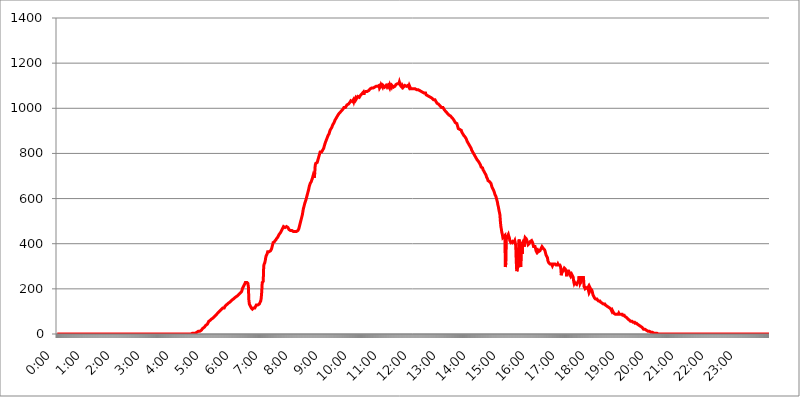
| Category | 2015.05.30. Intenzitás [W/m^2] |
|---|---|
| 0.0 | 0 |
| 0.0006944444444444445 | 0 |
| 0.001388888888888889 | 0 |
| 0.0020833333333333333 | 0 |
| 0.002777777777777778 | 0 |
| 0.003472222222222222 | 0 |
| 0.004166666666666667 | 0 |
| 0.004861111111111111 | 0 |
| 0.005555555555555556 | 0 |
| 0.0062499999999999995 | 0 |
| 0.006944444444444444 | 0 |
| 0.007638888888888889 | 0 |
| 0.008333333333333333 | 0 |
| 0.009027777777777779 | 0 |
| 0.009722222222222222 | 0 |
| 0.010416666666666666 | 0 |
| 0.011111111111111112 | 0 |
| 0.011805555555555555 | 0 |
| 0.012499999999999999 | 0 |
| 0.013194444444444444 | 0 |
| 0.013888888888888888 | 0 |
| 0.014583333333333332 | 0 |
| 0.015277777777777777 | 0 |
| 0.015972222222222224 | 0 |
| 0.016666666666666666 | 0 |
| 0.017361111111111112 | 0 |
| 0.018055555555555557 | 0 |
| 0.01875 | 0 |
| 0.019444444444444445 | 0 |
| 0.02013888888888889 | 0 |
| 0.020833333333333332 | 0 |
| 0.02152777777777778 | 0 |
| 0.022222222222222223 | 0 |
| 0.02291666666666667 | 0 |
| 0.02361111111111111 | 0 |
| 0.024305555555555556 | 0 |
| 0.024999999999999998 | 0 |
| 0.025694444444444447 | 0 |
| 0.02638888888888889 | 0 |
| 0.027083333333333334 | 0 |
| 0.027777777777777776 | 0 |
| 0.02847222222222222 | 0 |
| 0.029166666666666664 | 0 |
| 0.029861111111111113 | 0 |
| 0.030555555555555555 | 0 |
| 0.03125 | 0 |
| 0.03194444444444445 | 0 |
| 0.03263888888888889 | 0 |
| 0.03333333333333333 | 0 |
| 0.034027777777777775 | 0 |
| 0.034722222222222224 | 0 |
| 0.035416666666666666 | 0 |
| 0.036111111111111115 | 0 |
| 0.03680555555555556 | 0 |
| 0.0375 | 0 |
| 0.03819444444444444 | 0 |
| 0.03888888888888889 | 0 |
| 0.03958333333333333 | 0 |
| 0.04027777777777778 | 0 |
| 0.04097222222222222 | 0 |
| 0.041666666666666664 | 0 |
| 0.042361111111111106 | 0 |
| 0.04305555555555556 | 0 |
| 0.043750000000000004 | 0 |
| 0.044444444444444446 | 0 |
| 0.04513888888888889 | 0 |
| 0.04583333333333334 | 0 |
| 0.04652777777777778 | 0 |
| 0.04722222222222222 | 0 |
| 0.04791666666666666 | 0 |
| 0.04861111111111111 | 0 |
| 0.049305555555555554 | 0 |
| 0.049999999999999996 | 0 |
| 0.05069444444444445 | 0 |
| 0.051388888888888894 | 0 |
| 0.052083333333333336 | 0 |
| 0.05277777777777778 | 0 |
| 0.05347222222222222 | 0 |
| 0.05416666666666667 | 0 |
| 0.05486111111111111 | 0 |
| 0.05555555555555555 | 0 |
| 0.05625 | 0 |
| 0.05694444444444444 | 0 |
| 0.057638888888888885 | 0 |
| 0.05833333333333333 | 0 |
| 0.05902777777777778 | 0 |
| 0.059722222222222225 | 0 |
| 0.06041666666666667 | 0 |
| 0.061111111111111116 | 0 |
| 0.06180555555555556 | 0 |
| 0.0625 | 0 |
| 0.06319444444444444 | 0 |
| 0.06388888888888888 | 0 |
| 0.06458333333333334 | 0 |
| 0.06527777777777778 | 0 |
| 0.06597222222222222 | 0 |
| 0.06666666666666667 | 0 |
| 0.06736111111111111 | 0 |
| 0.06805555555555555 | 0 |
| 0.06874999999999999 | 0 |
| 0.06944444444444443 | 0 |
| 0.07013888888888889 | 0 |
| 0.07083333333333333 | 0 |
| 0.07152777777777779 | 0 |
| 0.07222222222222223 | 0 |
| 0.07291666666666667 | 0 |
| 0.07361111111111111 | 0 |
| 0.07430555555555556 | 0 |
| 0.075 | 0 |
| 0.07569444444444444 | 0 |
| 0.0763888888888889 | 0 |
| 0.07708333333333334 | 0 |
| 0.07777777777777778 | 0 |
| 0.07847222222222222 | 0 |
| 0.07916666666666666 | 0 |
| 0.0798611111111111 | 0 |
| 0.08055555555555556 | 0 |
| 0.08125 | 0 |
| 0.08194444444444444 | 0 |
| 0.08263888888888889 | 0 |
| 0.08333333333333333 | 0 |
| 0.08402777777777777 | 0 |
| 0.08472222222222221 | 0 |
| 0.08541666666666665 | 0 |
| 0.08611111111111112 | 0 |
| 0.08680555555555557 | 0 |
| 0.08750000000000001 | 0 |
| 0.08819444444444445 | 0 |
| 0.08888888888888889 | 0 |
| 0.08958333333333333 | 0 |
| 0.09027777777777778 | 0 |
| 0.09097222222222222 | 0 |
| 0.09166666666666667 | 0 |
| 0.09236111111111112 | 0 |
| 0.09305555555555556 | 0 |
| 0.09375 | 0 |
| 0.09444444444444444 | 0 |
| 0.09513888888888888 | 0 |
| 0.09583333333333333 | 0 |
| 0.09652777777777777 | 0 |
| 0.09722222222222222 | 0 |
| 0.09791666666666667 | 0 |
| 0.09861111111111111 | 0 |
| 0.09930555555555555 | 0 |
| 0.09999999999999999 | 0 |
| 0.10069444444444443 | 0 |
| 0.1013888888888889 | 0 |
| 0.10208333333333335 | 0 |
| 0.10277777777777779 | 0 |
| 0.10347222222222223 | 0 |
| 0.10416666666666667 | 0 |
| 0.10486111111111111 | 0 |
| 0.10555555555555556 | 0 |
| 0.10625 | 0 |
| 0.10694444444444444 | 0 |
| 0.1076388888888889 | 0 |
| 0.10833333333333334 | 0 |
| 0.10902777777777778 | 0 |
| 0.10972222222222222 | 0 |
| 0.1111111111111111 | 0 |
| 0.11180555555555556 | 0 |
| 0.11180555555555556 | 0 |
| 0.1125 | 0 |
| 0.11319444444444444 | 0 |
| 0.11388888888888889 | 0 |
| 0.11458333333333333 | 0 |
| 0.11527777777777777 | 0 |
| 0.11597222222222221 | 0 |
| 0.11666666666666665 | 0 |
| 0.1173611111111111 | 0 |
| 0.11805555555555557 | 0 |
| 0.11944444444444445 | 0 |
| 0.12013888888888889 | 0 |
| 0.12083333333333333 | 0 |
| 0.12152777777777778 | 0 |
| 0.12222222222222223 | 0 |
| 0.12291666666666667 | 0 |
| 0.12291666666666667 | 0 |
| 0.12361111111111112 | 0 |
| 0.12430555555555556 | 0 |
| 0.125 | 0 |
| 0.12569444444444444 | 0 |
| 0.12638888888888888 | 0 |
| 0.12708333333333333 | 0 |
| 0.16875 | 0 |
| 0.12847222222222224 | 0 |
| 0.12916666666666668 | 0 |
| 0.12986111111111112 | 0 |
| 0.13055555555555556 | 0 |
| 0.13125 | 0 |
| 0.13194444444444445 | 0 |
| 0.1326388888888889 | 0 |
| 0.13333333333333333 | 0 |
| 0.13402777777777777 | 0 |
| 0.13402777777777777 | 0 |
| 0.13472222222222222 | 0 |
| 0.13541666666666666 | 0 |
| 0.1361111111111111 | 0 |
| 0.13749999999999998 | 0 |
| 0.13819444444444443 | 0 |
| 0.1388888888888889 | 0 |
| 0.13958333333333334 | 0 |
| 0.14027777777777778 | 0 |
| 0.14097222222222222 | 0 |
| 0.14166666666666666 | 0 |
| 0.1423611111111111 | 0 |
| 0.14305555555555557 | 0 |
| 0.14375000000000002 | 0 |
| 0.14444444444444446 | 0 |
| 0.1451388888888889 | 0 |
| 0.1451388888888889 | 0 |
| 0.14652777777777778 | 0 |
| 0.14722222222222223 | 0 |
| 0.14791666666666667 | 0 |
| 0.1486111111111111 | 0 |
| 0.14930555555555555 | 0 |
| 0.15 | 0 |
| 0.15069444444444444 | 0 |
| 0.15138888888888888 | 0 |
| 0.15208333333333332 | 0 |
| 0.15277777777777776 | 0 |
| 0.15347222222222223 | 0 |
| 0.15416666666666667 | 0 |
| 0.15486111111111112 | 0 |
| 0.15555555555555556 | 0 |
| 0.15625 | 0 |
| 0.15694444444444444 | 0 |
| 0.15763888888888888 | 0 |
| 0.15833333333333333 | 0 |
| 0.15902777777777777 | 0 |
| 0.15972222222222224 | 0 |
| 0.16041666666666668 | 0 |
| 0.16111111111111112 | 0 |
| 0.16180555555555556 | 0 |
| 0.1625 | 0 |
| 0.16319444444444445 | 0 |
| 0.1638888888888889 | 0 |
| 0.16458333333333333 | 0 |
| 0.16527777777777777 | 0 |
| 0.16597222222222222 | 0 |
| 0.16666666666666666 | 0 |
| 0.1673611111111111 | 0 |
| 0.16805555555555554 | 0 |
| 0.16874999999999998 | 0 |
| 0.16944444444444443 | 0 |
| 0.17013888888888887 | 0 |
| 0.1708333333333333 | 0 |
| 0.17152777777777775 | 0 |
| 0.17222222222222225 | 0 |
| 0.1729166666666667 | 0 |
| 0.17361111111111113 | 0 |
| 0.17430555555555557 | 0 |
| 0.17500000000000002 | 0 |
| 0.17569444444444446 | 0 |
| 0.1763888888888889 | 0 |
| 0.17708333333333334 | 0 |
| 0.17777777777777778 | 0 |
| 0.17847222222222223 | 0 |
| 0.17916666666666667 | 0 |
| 0.1798611111111111 | 0 |
| 0.18055555555555555 | 0 |
| 0.18125 | 0 |
| 0.18194444444444444 | 0 |
| 0.1826388888888889 | 0 |
| 0.18333333333333335 | 0 |
| 0.1840277777777778 | 0 |
| 0.18472222222222223 | 0 |
| 0.18541666666666667 | 0 |
| 0.18611111111111112 | 0 |
| 0.18680555555555556 | 0 |
| 0.1875 | 0 |
| 0.18819444444444444 | 3.525 |
| 0.18888888888888888 | 3.525 |
| 0.18958333333333333 | 3.525 |
| 0.19027777777777777 | 3.525 |
| 0.1909722222222222 | 3.525 |
| 0.19166666666666665 | 3.525 |
| 0.19236111111111112 | 3.525 |
| 0.19305555555555554 | 3.525 |
| 0.19375 | 3.525 |
| 0.19444444444444445 | 7.887 |
| 0.1951388888888889 | 7.887 |
| 0.19583333333333333 | 7.887 |
| 0.19652777777777777 | 7.887 |
| 0.19722222222222222 | 12.257 |
| 0.19791666666666666 | 12.257 |
| 0.1986111111111111 | 12.257 |
| 0.19930555555555554 | 12.257 |
| 0.19999999999999998 | 12.257 |
| 0.20069444444444443 | 16.636 |
| 0.20138888888888887 | 16.636 |
| 0.2020833333333333 | 16.636 |
| 0.2027777777777778 | 21.024 |
| 0.2034722222222222 | 21.024 |
| 0.2041666666666667 | 25.419 |
| 0.20486111111111113 | 29.823 |
| 0.20555555555555557 | 29.823 |
| 0.20625000000000002 | 29.823 |
| 0.20694444444444446 | 29.823 |
| 0.2076388888888889 | 34.234 |
| 0.20833333333333334 | 38.653 |
| 0.20902777777777778 | 38.653 |
| 0.20972222222222223 | 43.079 |
| 0.21041666666666667 | 43.079 |
| 0.2111111111111111 | 47.511 |
| 0.21180555555555555 | 51.951 |
| 0.2125 | 56.398 |
| 0.21319444444444444 | 56.398 |
| 0.2138888888888889 | 56.398 |
| 0.21458333333333335 | 60.85 |
| 0.2152777777777778 | 60.85 |
| 0.21597222222222223 | 65.31 |
| 0.21666666666666667 | 65.31 |
| 0.21736111111111112 | 65.31 |
| 0.21805555555555556 | 69.775 |
| 0.21875 | 69.775 |
| 0.21944444444444444 | 74.246 |
| 0.22013888888888888 | 74.246 |
| 0.22083333333333333 | 78.722 |
| 0.22152777777777777 | 78.722 |
| 0.2222222222222222 | 83.205 |
| 0.22291666666666665 | 83.205 |
| 0.2236111111111111 | 87.692 |
| 0.22430555555555556 | 87.692 |
| 0.225 | 92.184 |
| 0.22569444444444445 | 92.184 |
| 0.2263888888888889 | 96.682 |
| 0.22708333333333333 | 96.682 |
| 0.22777777777777777 | 101.184 |
| 0.22847222222222222 | 101.184 |
| 0.22916666666666666 | 105.69 |
| 0.2298611111111111 | 105.69 |
| 0.23055555555555554 | 110.201 |
| 0.23124999999999998 | 110.201 |
| 0.23194444444444443 | 114.716 |
| 0.23263888888888887 | 114.716 |
| 0.2333333333333333 | 114.716 |
| 0.2340277777777778 | 114.716 |
| 0.2347222222222222 | 119.235 |
| 0.2354166666666667 | 123.758 |
| 0.23611111111111113 | 123.758 |
| 0.23680555555555557 | 128.284 |
| 0.23750000000000002 | 128.284 |
| 0.23819444444444446 | 128.284 |
| 0.2388888888888889 | 132.814 |
| 0.23958333333333334 | 132.814 |
| 0.24027777777777778 | 137.347 |
| 0.24097222222222223 | 137.347 |
| 0.24166666666666667 | 137.347 |
| 0.2423611111111111 | 141.884 |
| 0.24305555555555555 | 141.884 |
| 0.24375 | 146.423 |
| 0.24444444444444446 | 146.423 |
| 0.24513888888888888 | 150.964 |
| 0.24583333333333335 | 150.964 |
| 0.2465277777777778 | 150.964 |
| 0.24722222222222223 | 155.509 |
| 0.24791666666666667 | 155.509 |
| 0.24861111111111112 | 160.056 |
| 0.24930555555555556 | 160.056 |
| 0.25 | 160.056 |
| 0.25069444444444444 | 164.605 |
| 0.2513888888888889 | 164.605 |
| 0.2520833333333333 | 164.605 |
| 0.25277777777777777 | 169.156 |
| 0.2534722222222222 | 169.156 |
| 0.25416666666666665 | 173.709 |
| 0.2548611111111111 | 173.709 |
| 0.2555555555555556 | 178.264 |
| 0.25625000000000003 | 178.264 |
| 0.2569444444444445 | 182.82 |
| 0.2576388888888889 | 182.82 |
| 0.25833333333333336 | 187.378 |
| 0.2590277777777778 | 191.937 |
| 0.25972222222222224 | 201.058 |
| 0.2604166666666667 | 205.62 |
| 0.2611111111111111 | 210.182 |
| 0.26180555555555557 | 214.746 |
| 0.2625 | 219.309 |
| 0.26319444444444445 | 223.873 |
| 0.2638888888888889 | 228.436 |
| 0.26458333333333334 | 228.436 |
| 0.2652777777777778 | 228.436 |
| 0.2659722222222222 | 228.436 |
| 0.26666666666666666 | 228.436 |
| 0.2673611111111111 | 223.873 |
| 0.26805555555555555 | 210.182 |
| 0.26875 | 150.964 |
| 0.26944444444444443 | 132.814 |
| 0.2701388888888889 | 128.284 |
| 0.2708333333333333 | 123.758 |
| 0.27152777777777776 | 119.235 |
| 0.2722222222222222 | 114.716 |
| 0.27291666666666664 | 114.716 |
| 0.2736111111111111 | 110.201 |
| 0.2743055555555555 | 110.201 |
| 0.27499999999999997 | 114.716 |
| 0.27569444444444446 | 114.716 |
| 0.27638888888888885 | 114.716 |
| 0.27708333333333335 | 114.716 |
| 0.2777777777777778 | 119.235 |
| 0.27847222222222223 | 123.758 |
| 0.2791666666666667 | 128.284 |
| 0.2798611111111111 | 128.284 |
| 0.28055555555555556 | 128.284 |
| 0.28125 | 128.284 |
| 0.28194444444444444 | 128.284 |
| 0.2826388888888889 | 128.284 |
| 0.2833333333333333 | 132.814 |
| 0.28402777777777777 | 137.347 |
| 0.2847222222222222 | 141.884 |
| 0.28541666666666665 | 146.423 |
| 0.28611111111111115 | 160.056 |
| 0.28680555555555554 | 187.378 |
| 0.28750000000000003 | 228.436 |
| 0.2881944444444445 | 228.436 |
| 0.2888888888888889 | 233 |
| 0.28958333333333336 | 301.354 |
| 0.2902777777777778 | 310.44 |
| 0.29097222222222224 | 314.98 |
| 0.2916666666666667 | 324.052 |
| 0.2923611111111111 | 337.639 |
| 0.29305555555555557 | 346.682 |
| 0.29375 | 351.198 |
| 0.29444444444444445 | 355.712 |
| 0.2951388888888889 | 364.728 |
| 0.29583333333333334 | 364.728 |
| 0.2965277777777778 | 364.728 |
| 0.2972222222222222 | 364.728 |
| 0.29791666666666666 | 364.728 |
| 0.2986111111111111 | 364.728 |
| 0.29930555555555555 | 369.23 |
| 0.3 | 373.729 |
| 0.30069444444444443 | 378.224 |
| 0.3013888888888889 | 387.202 |
| 0.3020833333333333 | 396.164 |
| 0.30277777777777776 | 405.108 |
| 0.3034722222222222 | 405.108 |
| 0.30416666666666664 | 405.108 |
| 0.3048611111111111 | 409.574 |
| 0.3055555555555555 | 414.035 |
| 0.30624999999999997 | 414.035 |
| 0.3069444444444444 | 418.492 |
| 0.3076388888888889 | 422.943 |
| 0.30833333333333335 | 422.943 |
| 0.3090277777777778 | 427.39 |
| 0.30972222222222223 | 431.833 |
| 0.3104166666666667 | 436.27 |
| 0.3111111111111111 | 440.702 |
| 0.31180555555555556 | 440.702 |
| 0.3125 | 445.129 |
| 0.31319444444444444 | 449.551 |
| 0.3138888888888889 | 453.968 |
| 0.3145833333333333 | 458.38 |
| 0.31527777777777777 | 462.786 |
| 0.3159722222222222 | 467.187 |
| 0.31666666666666665 | 471.582 |
| 0.31736111111111115 | 475.972 |
| 0.31805555555555554 | 475.972 |
| 0.31875000000000003 | 475.972 |
| 0.3194444444444445 | 471.582 |
| 0.3201388888888889 | 475.972 |
| 0.32083333333333336 | 475.972 |
| 0.3215277777777778 | 475.972 |
| 0.32222222222222224 | 475.972 |
| 0.3229166666666667 | 471.582 |
| 0.3236111111111111 | 471.582 |
| 0.32430555555555557 | 467.187 |
| 0.325 | 462.786 |
| 0.32569444444444445 | 462.786 |
| 0.3263888888888889 | 458.38 |
| 0.32708333333333334 | 458.38 |
| 0.3277777777777778 | 458.38 |
| 0.3284722222222222 | 458.38 |
| 0.32916666666666666 | 458.38 |
| 0.3298611111111111 | 458.38 |
| 0.33055555555555555 | 453.968 |
| 0.33125 | 453.968 |
| 0.33194444444444443 | 453.968 |
| 0.3326388888888889 | 453.968 |
| 0.3333333333333333 | 453.968 |
| 0.3340277777777778 | 453.968 |
| 0.3347222222222222 | 453.968 |
| 0.3354166666666667 | 453.968 |
| 0.3361111111111111 | 458.38 |
| 0.3368055555555556 | 458.38 |
| 0.33749999999999997 | 458.38 |
| 0.33819444444444446 | 462.786 |
| 0.33888888888888885 | 467.187 |
| 0.33958333333333335 | 475.972 |
| 0.34027777777777773 | 484.735 |
| 0.34097222222222223 | 489.108 |
| 0.3416666666666666 | 502.192 |
| 0.3423611111111111 | 510.885 |
| 0.3430555555555555 | 519.555 |
| 0.34375 | 528.2 |
| 0.3444444444444445 | 541.121 |
| 0.3451388888888889 | 553.986 |
| 0.3458333333333334 | 562.53 |
| 0.34652777777777777 | 571.049 |
| 0.34722222222222227 | 579.542 |
| 0.34791666666666665 | 583.779 |
| 0.34861111111111115 | 592.233 |
| 0.34930555555555554 | 600.661 |
| 0.35000000000000003 | 609.062 |
| 0.3506944444444444 | 617.436 |
| 0.3513888888888889 | 625.784 |
| 0.3520833333333333 | 634.105 |
| 0.3527777777777778 | 642.4 |
| 0.3534722222222222 | 654.791 |
| 0.3541666666666667 | 658.909 |
| 0.3548611111111111 | 667.123 |
| 0.35555555555555557 | 667.123 |
| 0.35625 | 675.311 |
| 0.35694444444444445 | 679.395 |
| 0.3576388888888889 | 687.544 |
| 0.35833333333333334 | 695.666 |
| 0.3590277777777778 | 703.762 |
| 0.3597222222222222 | 699.717 |
| 0.36041666666666666 | 691.608 |
| 0.3611111111111111 | 711.832 |
| 0.36180555555555555 | 747.834 |
| 0.3625 | 755.766 |
| 0.36319444444444443 | 759.723 |
| 0.3638888888888889 | 759.723 |
| 0.3645833333333333 | 759.723 |
| 0.3652777777777778 | 767.62 |
| 0.3659722222222222 | 775.492 |
| 0.3666666666666667 | 783.342 |
| 0.3673611111111111 | 791.169 |
| 0.3680555555555556 | 798.974 |
| 0.36874999999999997 | 806.757 |
| 0.36944444444444446 | 806.757 |
| 0.37013888888888885 | 806.757 |
| 0.37083333333333335 | 806.757 |
| 0.37152777777777773 | 806.757 |
| 0.37222222222222223 | 814.519 |
| 0.3729166666666666 | 818.392 |
| 0.3736111111111111 | 822.26 |
| 0.3743055555555555 | 829.981 |
| 0.375 | 837.682 |
| 0.3756944444444445 | 845.365 |
| 0.3763888888888889 | 849.199 |
| 0.3770833333333334 | 856.855 |
| 0.37777777777777777 | 860.676 |
| 0.37847222222222227 | 868.305 |
| 0.37916666666666665 | 872.114 |
| 0.37986111111111115 | 879.719 |
| 0.38055555555555554 | 883.516 |
| 0.38125000000000003 | 887.309 |
| 0.3819444444444444 | 894.885 |
| 0.3826388888888889 | 902.447 |
| 0.3833333333333333 | 902.447 |
| 0.3840277777777778 | 909.996 |
| 0.3847222222222222 | 913.766 |
| 0.3854166666666667 | 917.534 |
| 0.3861111111111111 | 925.06 |
| 0.38680555555555557 | 928.819 |
| 0.3875 | 928.819 |
| 0.38819444444444445 | 936.33 |
| 0.3888888888888889 | 940.082 |
| 0.38958333333333334 | 947.58 |
| 0.3902777777777778 | 951.327 |
| 0.3909722222222222 | 955.071 |
| 0.39166666666666666 | 958.814 |
| 0.3923611111111111 | 962.555 |
| 0.39305555555555555 | 962.555 |
| 0.39375 | 966.295 |
| 0.39444444444444443 | 973.772 |
| 0.3951388888888889 | 973.772 |
| 0.3958333333333333 | 977.508 |
| 0.3965277777777778 | 981.244 |
| 0.3972222222222222 | 984.98 |
| 0.3979166666666667 | 984.98 |
| 0.3986111111111111 | 988.714 |
| 0.3993055555555556 | 988.714 |
| 0.39999999999999997 | 992.448 |
| 0.40069444444444446 | 996.182 |
| 0.40138888888888885 | 996.182 |
| 0.40208333333333335 | 1003.65 |
| 0.40277777777777773 | 1003.65 |
| 0.40347222222222223 | 999.916 |
| 0.4041666666666666 | 1003.65 |
| 0.4048611111111111 | 1007.383 |
| 0.4055555555555555 | 1007.383 |
| 0.40625 | 1014.852 |
| 0.4069444444444445 | 1014.852 |
| 0.4076388888888889 | 1014.852 |
| 0.4083333333333334 | 1018.587 |
| 0.40902777777777777 | 1022.323 |
| 0.40972222222222227 | 1022.323 |
| 0.41041666666666665 | 1026.06 |
| 0.41111111111111115 | 1026.06 |
| 0.41180555555555554 | 1033.537 |
| 0.41250000000000003 | 1029.798 |
| 0.4131944444444444 | 1029.798 |
| 0.4138888888888889 | 1029.798 |
| 0.4145833333333333 | 1026.06 |
| 0.4152777777777778 | 1037.277 |
| 0.4159722222222222 | 1029.798 |
| 0.4166666666666667 | 1037.277 |
| 0.4173611111111111 | 1041.019 |
| 0.41805555555555557 | 1044.762 |
| 0.41875 | 1037.277 |
| 0.41944444444444445 | 1037.277 |
| 0.4201388888888889 | 1044.762 |
| 0.42083333333333334 | 1044.762 |
| 0.4215277777777778 | 1052.255 |
| 0.4222222222222222 | 1052.255 |
| 0.42291666666666666 | 1052.255 |
| 0.4236111111111111 | 1048.508 |
| 0.42430555555555555 | 1052.255 |
| 0.425 | 1056.004 |
| 0.42569444444444443 | 1052.255 |
| 0.4263888888888889 | 1056.004 |
| 0.4270833333333333 | 1063.51 |
| 0.4277777777777778 | 1067.267 |
| 0.4284722222222222 | 1067.267 |
| 0.4291666666666667 | 1071.027 |
| 0.4298611111111111 | 1059.756 |
| 0.4305555555555556 | 1071.027 |
| 0.43124999999999997 | 1067.267 |
| 0.43194444444444446 | 1074.789 |
| 0.43263888888888885 | 1074.789 |
| 0.43333333333333335 | 1074.789 |
| 0.43402777777777773 | 1078.555 |
| 0.43472222222222223 | 1074.789 |
| 0.4354166666666666 | 1078.555 |
| 0.4361111111111111 | 1078.555 |
| 0.4368055555555555 | 1078.555 |
| 0.4375 | 1082.324 |
| 0.4381944444444445 | 1082.324 |
| 0.4388888888888889 | 1086.097 |
| 0.4395833333333334 | 1086.097 |
| 0.44027777777777777 | 1086.097 |
| 0.44097222222222227 | 1089.873 |
| 0.44166666666666665 | 1089.873 |
| 0.44236111111111115 | 1089.873 |
| 0.44305555555555554 | 1089.873 |
| 0.44375000000000003 | 1093.653 |
| 0.4444444444444444 | 1089.873 |
| 0.4451388888888889 | 1093.653 |
| 0.4458333333333333 | 1093.653 |
| 0.4465277777777778 | 1093.653 |
| 0.4472222222222222 | 1097.437 |
| 0.4479166666666667 | 1101.226 |
| 0.4486111111111111 | 1101.226 |
| 0.44930555555555557 | 1097.437 |
| 0.45 | 1097.437 |
| 0.45069444444444445 | 1097.437 |
| 0.4513888888888889 | 1101.226 |
| 0.45208333333333334 | 1089.873 |
| 0.4527777777777778 | 1093.653 |
| 0.4534722222222222 | 1097.437 |
| 0.45416666666666666 | 1105.019 |
| 0.4548611111111111 | 1101.226 |
| 0.45555555555555555 | 1101.226 |
| 0.45625 | 1093.653 |
| 0.45694444444444443 | 1101.226 |
| 0.4576388888888889 | 1101.226 |
| 0.4583333333333333 | 1101.226 |
| 0.4590277777777778 | 1093.653 |
| 0.4597222222222222 | 1097.437 |
| 0.4604166666666667 | 1093.653 |
| 0.4611111111111111 | 1101.226 |
| 0.4618055555555556 | 1101.226 |
| 0.46249999999999997 | 1093.653 |
| 0.46319444444444446 | 1093.653 |
| 0.46388888888888885 | 1101.226 |
| 0.46458333333333335 | 1101.226 |
| 0.46527777777777773 | 1093.653 |
| 0.46597222222222223 | 1101.226 |
| 0.4666666666666666 | 1093.653 |
| 0.4673611111111111 | 1101.226 |
| 0.4680555555555555 | 1101.226 |
| 0.46875 | 1093.653 |
| 0.4694444444444445 | 1101.226 |
| 0.4701388888888889 | 1101.226 |
| 0.4708333333333334 | 1101.226 |
| 0.47152777777777777 | 1093.653 |
| 0.47222222222222227 | 1093.653 |
| 0.47291666666666665 | 1097.437 |
| 0.47361111111111115 | 1097.437 |
| 0.47430555555555554 | 1101.226 |
| 0.47500000000000003 | 1105.019 |
| 0.4756944444444444 | 1108.816 |
| 0.4763888888888889 | 1108.816 |
| 0.4770833333333333 | 1108.816 |
| 0.4777777777777778 | 1108.816 |
| 0.4784722222222222 | 1108.816 |
| 0.4791666666666667 | 1108.816 |
| 0.4798611111111111 | 1116.426 |
| 0.48055555555555557 | 1108.816 |
| 0.48125 | 1101.226 |
| 0.48194444444444445 | 1101.226 |
| 0.4826388888888889 | 1101.226 |
| 0.48333333333333334 | 1093.653 |
| 0.4840277777777778 | 1101.226 |
| 0.4847222222222222 | 1101.226 |
| 0.48541666666666666 | 1093.653 |
| 0.4861111111111111 | 1097.437 |
| 0.48680555555555555 | 1093.653 |
| 0.4875 | 1101.226 |
| 0.48819444444444443 | 1105.019 |
| 0.4888888888888889 | 1097.437 |
| 0.4895833333333333 | 1097.437 |
| 0.4902777777777778 | 1093.653 |
| 0.4909722222222222 | 1097.437 |
| 0.4916666666666667 | 1101.226 |
| 0.4923611111111111 | 1101.226 |
| 0.4930555555555556 | 1093.653 |
| 0.49374999999999997 | 1101.226 |
| 0.49444444444444446 | 1097.437 |
| 0.49513888888888885 | 1097.437 |
| 0.49583333333333335 | 1086.097 |
| 0.49652777777777773 | 1089.873 |
| 0.49722222222222223 | 1086.097 |
| 0.4979166666666666 | 1086.097 |
| 0.4986111111111111 | 1086.097 |
| 0.4993055555555555 | 1082.324 |
| 0.5 | 1086.097 |
| 0.5006944444444444 | 1086.097 |
| 0.5013888888888889 | 1086.097 |
| 0.5020833333333333 | 1086.097 |
| 0.5027777777777778 | 1086.097 |
| 0.5034722222222222 | 1082.324 |
| 0.5041666666666667 | 1082.324 |
| 0.5048611111111111 | 1086.097 |
| 0.5055555555555555 | 1086.097 |
| 0.50625 | 1082.324 |
| 0.5069444444444444 | 1082.324 |
| 0.5076388888888889 | 1078.555 |
| 0.5083333333333333 | 1078.555 |
| 0.5090277777777777 | 1074.789 |
| 0.5097222222222222 | 1074.789 |
| 0.5104166666666666 | 1074.789 |
| 0.5111111111111112 | 1074.789 |
| 0.5118055555555555 | 1074.789 |
| 0.5125000000000001 | 1071.027 |
| 0.5131944444444444 | 1071.027 |
| 0.513888888888889 | 1067.267 |
| 0.5145833333333333 | 1067.267 |
| 0.5152777777777778 | 1063.51 |
| 0.5159722222222222 | 1063.51 |
| 0.5166666666666667 | 1067.267 |
| 0.517361111111111 | 1059.756 |
| 0.5180555555555556 | 1059.756 |
| 0.5187499999999999 | 1056.004 |
| 0.5194444444444445 | 1056.004 |
| 0.5201388888888888 | 1056.004 |
| 0.5208333333333334 | 1052.255 |
| 0.5215277777777778 | 1052.255 |
| 0.5222222222222223 | 1048.508 |
| 0.5229166666666667 | 1048.508 |
| 0.5236111111111111 | 1048.508 |
| 0.5243055555555556 | 1052.255 |
| 0.525 | 1044.762 |
| 0.5256944444444445 | 1044.762 |
| 0.5263888888888889 | 1041.019 |
| 0.5270833333333333 | 1041.019 |
| 0.5277777777777778 | 1037.277 |
| 0.5284722222222222 | 1037.277 |
| 0.5291666666666667 | 1033.537 |
| 0.5298611111111111 | 1037.277 |
| 0.5305555555555556 | 1033.537 |
| 0.53125 | 1029.798 |
| 0.5319444444444444 | 1029.798 |
| 0.5326388888888889 | 1022.323 |
| 0.5333333333333333 | 1022.323 |
| 0.5340277777777778 | 1022.323 |
| 0.5347222222222222 | 1018.587 |
| 0.5354166666666667 | 1014.852 |
| 0.5361111111111111 | 1014.852 |
| 0.5368055555555555 | 1011.118 |
| 0.5375 | 1007.383 |
| 0.5381944444444444 | 1007.383 |
| 0.5388888888888889 | 1003.65 |
| 0.5395833333333333 | 1003.65 |
| 0.5402777777777777 | 1003.65 |
| 0.5409722222222222 | 1003.65 |
| 0.5416666666666666 | 999.916 |
| 0.5423611111111112 | 999.916 |
| 0.5430555555555555 | 992.448 |
| 0.5437500000000001 | 996.182 |
| 0.5444444444444444 | 988.714 |
| 0.545138888888889 | 984.98 |
| 0.5458333333333333 | 981.244 |
| 0.5465277777777778 | 984.98 |
| 0.5472222222222222 | 977.508 |
| 0.5479166666666667 | 977.508 |
| 0.548611111111111 | 973.772 |
| 0.5493055555555556 | 970.034 |
| 0.5499999999999999 | 970.034 |
| 0.5506944444444445 | 970.034 |
| 0.5513888888888888 | 966.295 |
| 0.5520833333333334 | 962.555 |
| 0.5527777777777778 | 962.555 |
| 0.5534722222222223 | 958.814 |
| 0.5541666666666667 | 955.071 |
| 0.5548611111111111 | 955.071 |
| 0.5555555555555556 | 951.327 |
| 0.55625 | 947.58 |
| 0.5569444444444445 | 943.832 |
| 0.5576388888888889 | 943.832 |
| 0.5583333333333333 | 936.33 |
| 0.5590277777777778 | 932.576 |
| 0.5597222222222222 | 932.576 |
| 0.5604166666666667 | 932.576 |
| 0.5611111111111111 | 925.06 |
| 0.5618055555555556 | 917.534 |
| 0.5625 | 909.996 |
| 0.5631944444444444 | 909.996 |
| 0.5638888888888889 | 909.996 |
| 0.5645833333333333 | 906.223 |
| 0.5652777777777778 | 906.223 |
| 0.5659722222222222 | 902.447 |
| 0.5666666666666667 | 902.447 |
| 0.5673611111111111 | 894.885 |
| 0.5680555555555555 | 891.099 |
| 0.56875 | 887.309 |
| 0.5694444444444444 | 883.516 |
| 0.5701388888888889 | 879.719 |
| 0.5708333333333333 | 879.719 |
| 0.5715277777777777 | 875.918 |
| 0.5722222222222222 | 872.114 |
| 0.5729166666666666 | 868.305 |
| 0.5736111111111112 | 864.493 |
| 0.5743055555555555 | 860.676 |
| 0.5750000000000001 | 853.029 |
| 0.5756944444444444 | 849.199 |
| 0.576388888888889 | 845.365 |
| 0.5770833333333333 | 841.526 |
| 0.5777777777777778 | 837.682 |
| 0.5784722222222222 | 833.834 |
| 0.5791666666666667 | 829.981 |
| 0.579861111111111 | 826.123 |
| 0.5805555555555556 | 822.26 |
| 0.5812499999999999 | 814.519 |
| 0.5819444444444445 | 810.641 |
| 0.5826388888888888 | 806.757 |
| 0.5833333333333334 | 806.757 |
| 0.5840277777777778 | 802.868 |
| 0.5847222222222223 | 795.074 |
| 0.5854166666666667 | 791.169 |
| 0.5861111111111111 | 787.258 |
| 0.5868055555555556 | 783.342 |
| 0.5875 | 779.42 |
| 0.5881944444444445 | 775.492 |
| 0.5888888888888889 | 771.559 |
| 0.5895833333333333 | 767.62 |
| 0.5902777777777778 | 767.62 |
| 0.5909722222222222 | 763.674 |
| 0.5916666666666667 | 759.723 |
| 0.5923611111111111 | 755.766 |
| 0.5930555555555556 | 751.803 |
| 0.59375 | 747.834 |
| 0.5944444444444444 | 739.877 |
| 0.5951388888888889 | 739.877 |
| 0.5958333333333333 | 735.89 |
| 0.5965277777777778 | 735.89 |
| 0.5972222222222222 | 727.896 |
| 0.5979166666666667 | 723.889 |
| 0.5986111111111111 | 719.877 |
| 0.5993055555555555 | 715.858 |
| 0.6 | 711.832 |
| 0.6006944444444444 | 707.8 |
| 0.6013888888888889 | 703.762 |
| 0.6020833333333333 | 695.666 |
| 0.6027777777777777 | 691.608 |
| 0.6034722222222222 | 687.544 |
| 0.6041666666666666 | 679.395 |
| 0.6048611111111112 | 675.311 |
| 0.6055555555555555 | 679.395 |
| 0.6062500000000001 | 675.311 |
| 0.6069444444444444 | 671.22 |
| 0.607638888888889 | 671.22 |
| 0.6083333333333333 | 667.123 |
| 0.6090277777777778 | 658.909 |
| 0.6097222222222222 | 650.667 |
| 0.6104166666666667 | 650.667 |
| 0.611111111111111 | 650.667 |
| 0.6118055555555556 | 638.256 |
| 0.6124999999999999 | 634.105 |
| 0.6131944444444445 | 625.784 |
| 0.6138888888888888 | 617.436 |
| 0.6145833333333334 | 613.252 |
| 0.6152777777777778 | 609.062 |
| 0.6159722222222223 | 600.661 |
| 0.6166666666666667 | 592.233 |
| 0.6173611111111111 | 583.779 |
| 0.6180555555555556 | 571.049 |
| 0.61875 | 562.53 |
| 0.6194444444444445 | 549.704 |
| 0.6201388888888889 | 545.416 |
| 0.6208333333333333 | 528.2 |
| 0.6215277777777778 | 497.836 |
| 0.6222222222222222 | 475.972 |
| 0.6229166666666667 | 462.786 |
| 0.6236111111111111 | 449.551 |
| 0.6243055555555556 | 440.702 |
| 0.625 | 427.39 |
| 0.6256944444444444 | 427.39 |
| 0.6263888888888889 | 431.833 |
| 0.6270833333333333 | 431.833 |
| 0.6277777777777778 | 436.27 |
| 0.6284722222222222 | 296.808 |
| 0.6291666666666667 | 314.98 |
| 0.6298611111111111 | 418.492 |
| 0.6305555555555555 | 431.833 |
| 0.63125 | 431.833 |
| 0.6319444444444444 | 436.27 |
| 0.6326388888888889 | 440.702 |
| 0.6333333333333333 | 431.833 |
| 0.6340277777777777 | 427.39 |
| 0.6347222222222222 | 414.035 |
| 0.6354166666666666 | 409.574 |
| 0.6361111111111112 | 405.108 |
| 0.6368055555555555 | 405.108 |
| 0.6375000000000001 | 405.108 |
| 0.6381944444444444 | 409.574 |
| 0.638888888888889 | 405.108 |
| 0.6395833333333333 | 405.108 |
| 0.6402777777777778 | 405.108 |
| 0.6409722222222222 | 409.574 |
| 0.6416666666666667 | 414.035 |
| 0.642361111111111 | 414.035 |
| 0.6430555555555556 | 391.685 |
| 0.6437499999999999 | 324.052 |
| 0.6444444444444445 | 278.603 |
| 0.6451388888888888 | 283.156 |
| 0.6458333333333334 | 296.808 |
| 0.6465277777777778 | 319.517 |
| 0.6472222222222223 | 396.164 |
| 0.6479166666666667 | 418.492 |
| 0.6486111111111111 | 355.712 |
| 0.6493055555555556 | 301.354 |
| 0.65 | 296.808 |
| 0.6506944444444445 | 369.23 |
| 0.6513888888888889 | 405.108 |
| 0.6520833333333333 | 355.712 |
| 0.6527777777777778 | 405.108 |
| 0.6534722222222222 | 409.574 |
| 0.6541666666666667 | 405.108 |
| 0.6548611111111111 | 387.202 |
| 0.6555555555555556 | 414.035 |
| 0.65625 | 427.39 |
| 0.6569444444444444 | 427.39 |
| 0.6576388888888889 | 422.943 |
| 0.6583333333333333 | 418.492 |
| 0.6590277777777778 | 409.574 |
| 0.6597222222222222 | 405.108 |
| 0.6604166666666667 | 396.164 |
| 0.6611111111111111 | 396.164 |
| 0.6618055555555555 | 400.638 |
| 0.6625 | 405.108 |
| 0.6631944444444444 | 409.574 |
| 0.6638888888888889 | 409.574 |
| 0.6645833333333333 | 409.574 |
| 0.6652777777777777 | 414.035 |
| 0.6659722222222222 | 414.035 |
| 0.6666666666666666 | 405.108 |
| 0.6673611111111111 | 396.164 |
| 0.6680555555555556 | 387.202 |
| 0.6687500000000001 | 387.202 |
| 0.6694444444444444 | 387.202 |
| 0.6701388888888888 | 387.202 |
| 0.6708333333333334 | 378.224 |
| 0.6715277777777778 | 369.23 |
| 0.6722222222222222 | 364.728 |
| 0.6729166666666666 | 369.23 |
| 0.6736111111111112 | 364.728 |
| 0.6743055555555556 | 369.23 |
| 0.6749999999999999 | 364.728 |
| 0.6756944444444444 | 364.728 |
| 0.6763888888888889 | 364.728 |
| 0.6770833333333334 | 369.23 |
| 0.6777777777777777 | 369.23 |
| 0.6784722222222223 | 378.224 |
| 0.6791666666666667 | 382.715 |
| 0.6798611111111111 | 387.202 |
| 0.6805555555555555 | 387.202 |
| 0.68125 | 387.202 |
| 0.6819444444444445 | 378.224 |
| 0.6826388888888889 | 378.224 |
| 0.6833333333333332 | 373.729 |
| 0.6840277777777778 | 369.23 |
| 0.6847222222222222 | 360.221 |
| 0.6854166666666667 | 351.198 |
| 0.686111111111111 | 346.682 |
| 0.6868055555555556 | 342.162 |
| 0.6875 | 337.639 |
| 0.6881944444444444 | 324.052 |
| 0.688888888888889 | 319.517 |
| 0.6895833333333333 | 314.98 |
| 0.6902777777777778 | 314.98 |
| 0.6909722222222222 | 310.44 |
| 0.6916666666666668 | 310.44 |
| 0.6923611111111111 | 310.44 |
| 0.6930555555555555 | 310.44 |
| 0.69375 | 305.898 |
| 0.6944444444444445 | 301.354 |
| 0.6951388888888889 | 305.898 |
| 0.6958333333333333 | 310.44 |
| 0.6965277777777777 | 310.44 |
| 0.6972222222222223 | 310.44 |
| 0.6979166666666666 | 310.44 |
| 0.6986111111111111 | 310.44 |
| 0.6993055555555556 | 305.898 |
| 0.7000000000000001 | 305.898 |
| 0.7006944444444444 | 305.898 |
| 0.7013888888888888 | 305.898 |
| 0.7020833333333334 | 310.44 |
| 0.7027777777777778 | 305.898 |
| 0.7034722222222222 | 305.898 |
| 0.7041666666666666 | 305.898 |
| 0.7048611111111112 | 305.898 |
| 0.7055555555555556 | 301.354 |
| 0.7062499999999999 | 292.259 |
| 0.7069444444444444 | 260.373 |
| 0.7076388888888889 | 278.603 |
| 0.7083333333333334 | 274.047 |
| 0.7090277777777777 | 278.603 |
| 0.7097222222222223 | 278.603 |
| 0.7104166666666667 | 287.709 |
| 0.7111111111111111 | 292.259 |
| 0.7118055555555555 | 292.259 |
| 0.7125 | 287.709 |
| 0.7131944444444445 | 278.603 |
| 0.7138888888888889 | 274.047 |
| 0.7145833333333332 | 255.813 |
| 0.7152777777777778 | 278.603 |
| 0.7159722222222222 | 278.603 |
| 0.7166666666666667 | 278.603 |
| 0.717361111111111 | 278.603 |
| 0.7180555555555556 | 278.603 |
| 0.71875 | 269.49 |
| 0.7194444444444444 | 260.373 |
| 0.720138888888889 | 255.813 |
| 0.7208333333333333 | 260.373 |
| 0.7215277777777778 | 264.932 |
| 0.7222222222222222 | 260.373 |
| 0.7229166666666668 | 260.373 |
| 0.7236111111111111 | 251.251 |
| 0.7243055555555555 | 233 |
| 0.725 | 223.873 |
| 0.7256944444444445 | 228.436 |
| 0.7263888888888889 | 223.873 |
| 0.7270833333333333 | 223.873 |
| 0.7277777777777777 | 223.873 |
| 0.7284722222222223 | 219.309 |
| 0.7291666666666666 | 219.309 |
| 0.7298611111111111 | 219.309 |
| 0.7305555555555556 | 233 |
| 0.7312500000000001 | 237.564 |
| 0.7319444444444444 | 255.813 |
| 0.7326388888888888 | 255.813 |
| 0.7333333333333334 | 223.873 |
| 0.7340277777777778 | 228.436 |
| 0.7347222222222222 | 233 |
| 0.7354166666666666 | 255.813 |
| 0.7361111111111112 | 242.127 |
| 0.7368055555555556 | 246.689 |
| 0.7374999999999999 | 255.813 |
| 0.7381944444444444 | 242.127 |
| 0.7388888888888889 | 210.182 |
| 0.7395833333333334 | 205.62 |
| 0.7402777777777777 | 201.058 |
| 0.7409722222222223 | 201.058 |
| 0.7416666666666667 | 205.62 |
| 0.7423611111111111 | 205.62 |
| 0.7430555555555555 | 205.62 |
| 0.74375 | 201.058 |
| 0.7444444444444445 | 205.62 |
| 0.7451388888888889 | 191.937 |
| 0.7458333333333332 | 182.82 |
| 0.7465277777777778 | 187.378 |
| 0.7472222222222222 | 205.62 |
| 0.7479166666666667 | 201.058 |
| 0.748611111111111 | 201.058 |
| 0.7493055555555556 | 196.497 |
| 0.75 | 191.937 |
| 0.7506944444444444 | 182.82 |
| 0.751388888888889 | 173.709 |
| 0.7520833333333333 | 169.156 |
| 0.7527777777777778 | 164.605 |
| 0.7534722222222222 | 160.056 |
| 0.7541666666666668 | 160.056 |
| 0.7548611111111111 | 155.509 |
| 0.7555555555555555 | 155.509 |
| 0.75625 | 155.509 |
| 0.7569444444444445 | 155.509 |
| 0.7576388888888889 | 150.964 |
| 0.7583333333333333 | 150.964 |
| 0.7590277777777777 | 146.423 |
| 0.7597222222222223 | 146.423 |
| 0.7604166666666666 | 146.423 |
| 0.7611111111111111 | 146.423 |
| 0.7618055555555556 | 141.884 |
| 0.7625000000000001 | 141.884 |
| 0.7631944444444444 | 141.884 |
| 0.7638888888888888 | 137.347 |
| 0.7645833333333334 | 137.347 |
| 0.7652777777777778 | 137.347 |
| 0.7659722222222222 | 132.814 |
| 0.7666666666666666 | 132.814 |
| 0.7673611111111112 | 132.814 |
| 0.7680555555555556 | 132.814 |
| 0.7687499999999999 | 128.284 |
| 0.7694444444444444 | 128.284 |
| 0.7701388888888889 | 128.284 |
| 0.7708333333333334 | 123.758 |
| 0.7715277777777777 | 123.758 |
| 0.7722222222222223 | 123.758 |
| 0.7729166666666667 | 119.235 |
| 0.7736111111111111 | 119.235 |
| 0.7743055555555555 | 119.235 |
| 0.775 | 114.716 |
| 0.7756944444444445 | 114.716 |
| 0.7763888888888889 | 110.201 |
| 0.7770833333333332 | 105.69 |
| 0.7777777777777778 | 101.184 |
| 0.7784722222222222 | 105.69 |
| 0.7791666666666667 | 101.184 |
| 0.779861111111111 | 101.184 |
| 0.7805555555555556 | 92.184 |
| 0.78125 | 92.184 |
| 0.7819444444444444 | 92.184 |
| 0.782638888888889 | 87.692 |
| 0.7833333333333333 | 87.692 |
| 0.7840277777777778 | 87.692 |
| 0.7847222222222222 | 87.692 |
| 0.7854166666666668 | 87.692 |
| 0.7861111111111111 | 87.692 |
| 0.7868055555555555 | 87.692 |
| 0.7875 | 92.184 |
| 0.7881944444444445 | 87.692 |
| 0.7888888888888889 | 87.692 |
| 0.7895833333333333 | 87.692 |
| 0.7902777777777777 | 87.692 |
| 0.7909722222222223 | 87.692 |
| 0.7916666666666666 | 87.692 |
| 0.7923611111111111 | 87.692 |
| 0.7930555555555556 | 83.205 |
| 0.7937500000000001 | 83.205 |
| 0.7944444444444444 | 83.205 |
| 0.7951388888888888 | 83.205 |
| 0.7958333333333334 | 78.722 |
| 0.7965277777777778 | 78.722 |
| 0.7972222222222222 | 78.722 |
| 0.7979166666666666 | 74.246 |
| 0.7986111111111112 | 74.246 |
| 0.7993055555555556 | 69.775 |
| 0.7999999999999999 | 69.775 |
| 0.8006944444444444 | 65.31 |
| 0.8013888888888889 | 65.31 |
| 0.8020833333333334 | 65.31 |
| 0.8027777777777777 | 60.85 |
| 0.8034722222222223 | 60.85 |
| 0.8041666666666667 | 56.398 |
| 0.8048611111111111 | 56.398 |
| 0.8055555555555555 | 56.398 |
| 0.80625 | 56.398 |
| 0.8069444444444445 | 56.398 |
| 0.8076388888888889 | 51.951 |
| 0.8083333333333332 | 51.951 |
| 0.8090277777777778 | 51.951 |
| 0.8097222222222222 | 51.951 |
| 0.8104166666666667 | 47.511 |
| 0.811111111111111 | 47.511 |
| 0.8118055555555556 | 47.511 |
| 0.8125 | 47.511 |
| 0.8131944444444444 | 47.511 |
| 0.813888888888889 | 43.079 |
| 0.8145833333333333 | 43.079 |
| 0.8152777777777778 | 43.079 |
| 0.8159722222222222 | 38.653 |
| 0.8166666666666668 | 38.653 |
| 0.8173611111111111 | 38.653 |
| 0.8180555555555555 | 34.234 |
| 0.81875 | 29.823 |
| 0.8194444444444445 | 29.823 |
| 0.8201388888888889 | 29.823 |
| 0.8208333333333333 | 25.419 |
| 0.8215277777777777 | 25.419 |
| 0.8222222222222223 | 21.024 |
| 0.8229166666666666 | 21.024 |
| 0.8236111111111111 | 21.024 |
| 0.8243055555555556 | 21.024 |
| 0.8250000000000001 | 16.636 |
| 0.8256944444444444 | 16.636 |
| 0.8263888888888888 | 16.636 |
| 0.8270833333333334 | 16.636 |
| 0.8277777777777778 | 16.636 |
| 0.8284722222222222 | 12.257 |
| 0.8291666666666666 | 12.257 |
| 0.8298611111111112 | 12.257 |
| 0.8305555555555556 | 12.257 |
| 0.8312499999999999 | 12.257 |
| 0.8319444444444444 | 12.257 |
| 0.8326388888888889 | 7.887 |
| 0.8333333333333334 | 7.887 |
| 0.8340277777777777 | 7.887 |
| 0.8347222222222223 | 7.887 |
| 0.8354166666666667 | 7.887 |
| 0.8361111111111111 | 3.525 |
| 0.8368055555555555 | 3.525 |
| 0.8375 | 3.525 |
| 0.8381944444444445 | 3.525 |
| 0.8388888888888889 | 3.525 |
| 0.8395833333333332 | 3.525 |
| 0.8402777777777778 | 3.525 |
| 0.8409722222222222 | 3.525 |
| 0.8416666666666667 | 3.525 |
| 0.842361111111111 | 3.525 |
| 0.8430555555555556 | 0 |
| 0.84375 | 0 |
| 0.8444444444444444 | 0 |
| 0.845138888888889 | 0 |
| 0.8458333333333333 | 0 |
| 0.8465277777777778 | 0 |
| 0.8472222222222222 | 0 |
| 0.8479166666666668 | 0 |
| 0.8486111111111111 | 0 |
| 0.8493055555555555 | 0 |
| 0.85 | 0 |
| 0.8506944444444445 | 0 |
| 0.8513888888888889 | 0 |
| 0.8520833333333333 | 0 |
| 0.8527777777777777 | 0 |
| 0.8534722222222223 | 0 |
| 0.8541666666666666 | 0 |
| 0.8548611111111111 | 0 |
| 0.8555555555555556 | 0 |
| 0.8562500000000001 | 0 |
| 0.8569444444444444 | 0 |
| 0.8576388888888888 | 0 |
| 0.8583333333333334 | 0 |
| 0.8590277777777778 | 0 |
| 0.8597222222222222 | 0 |
| 0.8604166666666666 | 0 |
| 0.8611111111111112 | 0 |
| 0.8618055555555556 | 0 |
| 0.8624999999999999 | 0 |
| 0.8631944444444444 | 0 |
| 0.8638888888888889 | 0 |
| 0.8645833333333334 | 0 |
| 0.8652777777777777 | 0 |
| 0.8659722222222223 | 0 |
| 0.8666666666666667 | 0 |
| 0.8673611111111111 | 0 |
| 0.8680555555555555 | 0 |
| 0.86875 | 0 |
| 0.8694444444444445 | 0 |
| 0.8701388888888889 | 0 |
| 0.8708333333333332 | 0 |
| 0.8715277777777778 | 0 |
| 0.8722222222222222 | 0 |
| 0.8729166666666667 | 0 |
| 0.873611111111111 | 0 |
| 0.8743055555555556 | 0 |
| 0.875 | 0 |
| 0.8756944444444444 | 0 |
| 0.876388888888889 | 0 |
| 0.8770833333333333 | 0 |
| 0.8777777777777778 | 0 |
| 0.8784722222222222 | 0 |
| 0.8791666666666668 | 0 |
| 0.8798611111111111 | 0 |
| 0.8805555555555555 | 0 |
| 0.88125 | 0 |
| 0.8819444444444445 | 0 |
| 0.8826388888888889 | 0 |
| 0.8833333333333333 | 0 |
| 0.8840277777777777 | 0 |
| 0.8847222222222223 | 0 |
| 0.8854166666666666 | 0 |
| 0.8861111111111111 | 0 |
| 0.8868055555555556 | 0 |
| 0.8875000000000001 | 0 |
| 0.8881944444444444 | 0 |
| 0.8888888888888888 | 0 |
| 0.8895833333333334 | 0 |
| 0.8902777777777778 | 0 |
| 0.8909722222222222 | 0 |
| 0.8916666666666666 | 0 |
| 0.8923611111111112 | 0 |
| 0.8930555555555556 | 0 |
| 0.8937499999999999 | 0 |
| 0.8944444444444444 | 0 |
| 0.8951388888888889 | 0 |
| 0.8958333333333334 | 0 |
| 0.8965277777777777 | 0 |
| 0.8972222222222223 | 0 |
| 0.8979166666666667 | 0 |
| 0.8986111111111111 | 0 |
| 0.8993055555555555 | 0 |
| 0.9 | 0 |
| 0.9006944444444445 | 0 |
| 0.9013888888888889 | 0 |
| 0.9020833333333332 | 0 |
| 0.9027777777777778 | 0 |
| 0.9034722222222222 | 0 |
| 0.9041666666666667 | 0 |
| 0.904861111111111 | 0 |
| 0.9055555555555556 | 0 |
| 0.90625 | 0 |
| 0.9069444444444444 | 0 |
| 0.907638888888889 | 0 |
| 0.9083333333333333 | 0 |
| 0.9090277777777778 | 0 |
| 0.9097222222222222 | 0 |
| 0.9104166666666668 | 0 |
| 0.9111111111111111 | 0 |
| 0.9118055555555555 | 0 |
| 0.9125 | 0 |
| 0.9131944444444445 | 0 |
| 0.9138888888888889 | 0 |
| 0.9145833333333333 | 0 |
| 0.9152777777777777 | 0 |
| 0.9159722222222223 | 0 |
| 0.9166666666666666 | 0 |
| 0.9173611111111111 | 0 |
| 0.9180555555555556 | 0 |
| 0.9187500000000001 | 0 |
| 0.9194444444444444 | 0 |
| 0.9201388888888888 | 0 |
| 0.9208333333333334 | 0 |
| 0.9215277777777778 | 0 |
| 0.9222222222222222 | 0 |
| 0.9229166666666666 | 0 |
| 0.9236111111111112 | 0 |
| 0.9243055555555556 | 0 |
| 0.9249999999999999 | 0 |
| 0.9256944444444444 | 0 |
| 0.9263888888888889 | 0 |
| 0.9270833333333334 | 0 |
| 0.9277777777777777 | 0 |
| 0.9284722222222223 | 0 |
| 0.9291666666666667 | 0 |
| 0.9298611111111111 | 0 |
| 0.9305555555555555 | 0 |
| 0.93125 | 0 |
| 0.9319444444444445 | 0 |
| 0.9326388888888889 | 0 |
| 0.9333333333333332 | 0 |
| 0.9340277777777778 | 0 |
| 0.9347222222222222 | 0 |
| 0.9354166666666667 | 0 |
| 0.936111111111111 | 0 |
| 0.9368055555555556 | 0 |
| 0.9375 | 0 |
| 0.9381944444444444 | 0 |
| 0.938888888888889 | 0 |
| 0.9395833333333333 | 0 |
| 0.9402777777777778 | 0 |
| 0.9409722222222222 | 0 |
| 0.9416666666666668 | 0 |
| 0.9423611111111111 | 0 |
| 0.9430555555555555 | 0 |
| 0.94375 | 0 |
| 0.9444444444444445 | 0 |
| 0.9451388888888889 | 0 |
| 0.9458333333333333 | 0 |
| 0.9465277777777777 | 0 |
| 0.9472222222222223 | 0 |
| 0.9479166666666666 | 0 |
| 0.9486111111111111 | 0 |
| 0.9493055555555556 | 0 |
| 0.9500000000000001 | 0 |
| 0.9506944444444444 | 0 |
| 0.9513888888888888 | 0 |
| 0.9520833333333334 | 0 |
| 0.9527777777777778 | 0 |
| 0.9534722222222222 | 0 |
| 0.9541666666666666 | 0 |
| 0.9548611111111112 | 0 |
| 0.9555555555555556 | 0 |
| 0.9562499999999999 | 0 |
| 0.9569444444444444 | 0 |
| 0.9576388888888889 | 0 |
| 0.9583333333333334 | 0 |
| 0.9590277777777777 | 0 |
| 0.9597222222222223 | 0 |
| 0.9604166666666667 | 0 |
| 0.9611111111111111 | 0 |
| 0.9618055555555555 | 0 |
| 0.9625 | 0 |
| 0.9631944444444445 | 0 |
| 0.9638888888888889 | 0 |
| 0.9645833333333332 | 0 |
| 0.9652777777777778 | 0 |
| 0.9659722222222222 | 0 |
| 0.9666666666666667 | 0 |
| 0.967361111111111 | 0 |
| 0.9680555555555556 | 0 |
| 0.96875 | 0 |
| 0.9694444444444444 | 0 |
| 0.970138888888889 | 0 |
| 0.9708333333333333 | 0 |
| 0.9715277777777778 | 0 |
| 0.9722222222222222 | 0 |
| 0.9729166666666668 | 0 |
| 0.9736111111111111 | 0 |
| 0.9743055555555555 | 0 |
| 0.975 | 0 |
| 0.9756944444444445 | 0 |
| 0.9763888888888889 | 0 |
| 0.9770833333333333 | 0 |
| 0.9777777777777777 | 0 |
| 0.9784722222222223 | 0 |
| 0.9791666666666666 | 0 |
| 0.9798611111111111 | 0 |
| 0.9805555555555556 | 0 |
| 0.9812500000000001 | 0 |
| 0.9819444444444444 | 0 |
| 0.9826388888888888 | 0 |
| 0.9833333333333334 | 0 |
| 0.9840277777777778 | 0 |
| 0.9847222222222222 | 0 |
| 0.9854166666666666 | 0 |
| 0.9861111111111112 | 0 |
| 0.9868055555555556 | 0 |
| 0.9874999999999999 | 0 |
| 0.9881944444444444 | 0 |
| 0.9888888888888889 | 0 |
| 0.9895833333333334 | 0 |
| 0.9902777777777777 | 0 |
| 0.9909722222222223 | 0 |
| 0.9916666666666667 | 0 |
| 0.9923611111111111 | 0 |
| 0.9930555555555555 | 0 |
| 0.99375 | 0 |
| 0.9944444444444445 | 0 |
| 0.9951388888888889 | 0 |
| 0.9958333333333332 | 0 |
| 0.9965277777777778 | 0 |
| 0.9972222222222222 | 0 |
| 0.9979166666666667 | 0 |
| 0.998611111111111 | 0 |
| 0.9993055555555556 | 0 |